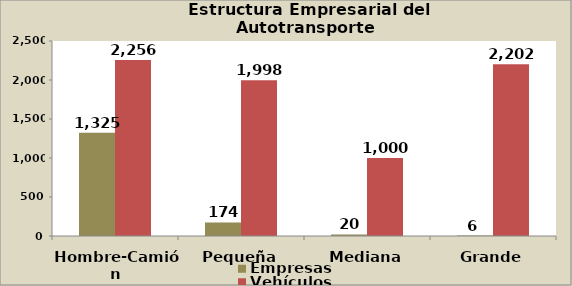
| Category | Empresas | Vehículos |
|---|---|---|
| Hombre-Camión | 1325 | 2256 |
| Pequeña | 174 | 1998 |
| Mediana | 20 | 1000 |
| Grande | 6 | 2202 |